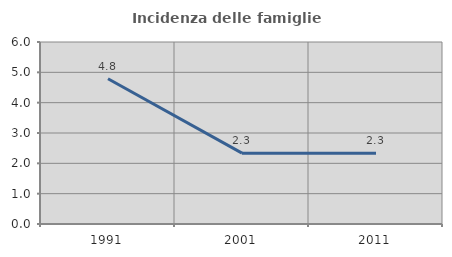
| Category | Incidenza delle famiglie numerose |
|---|---|
| 1991.0 | 4.789 |
| 2001.0 | 2.336 |
| 2011.0 | 2.331 |